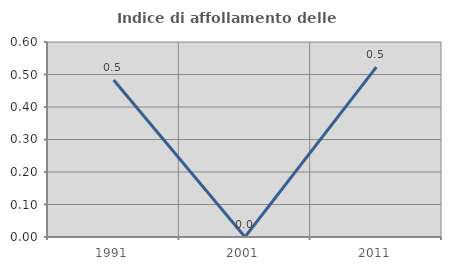
| Category | Indice di affollamento delle abitazioni  |
|---|---|
| 1991.0 | 0.483 |
| 2001.0 | 0 |
| 2011.0 | 0.523 |